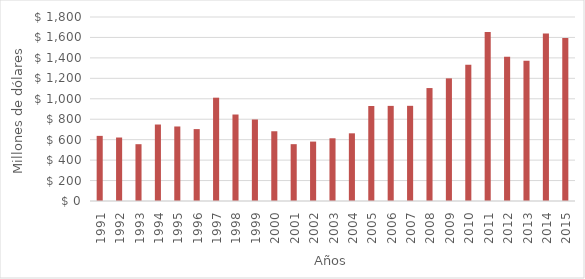
| Category | Precio CIF(US$ millones) |
|---|---|
| 1991.0 | 637.101 |
| 1992.0 | 621.057 |
| 1993.0 | 555.763 |
| 1994.0 | 748.16 |
| 1995.0 | 729.033 |
| 1996.0 | 703.384 |
| 1997.0 | 1010.741 |
| 1998.0 | 846.118 |
| 1999.0 | 797.606 |
| 2000.0 | 682.316 |
| 2001.0 | 555.976 |
| 2002.0 | 581.198 |
| 2003.0 | 613.509 |
| 2004.0 | 662.081 |
| 2005.0 | 929.237 |
| 2006.0 | 930.496 |
| 2007.0 | 931.145 |
| 2008.0 | 1104.894 |
| 2009.0 | 1199.697 |
| 2010.0 | 1333.321 |
| 2011.0 | 1654.443 |
| 2012.0 | 1410.312 |
| 2013.0 | 1371.831 |
| 2014.0 | 1638.598 |
| 2015.0 | 1593.378 |